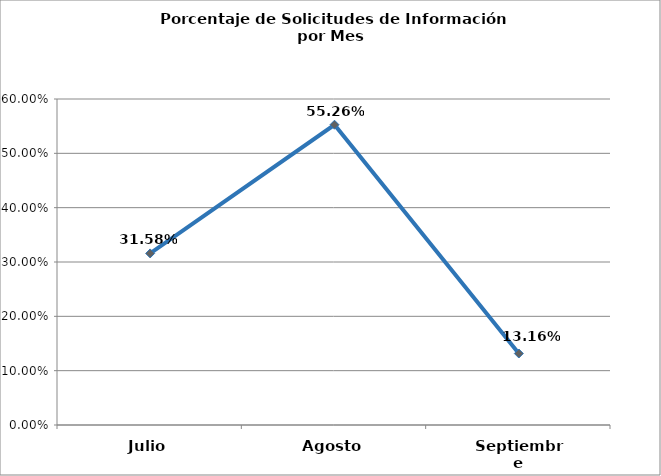
| Category | Series 0 |
|---|---|
| Julio | 0.316 |
| Agosto | 0.553 |
| Septiembre | 0.132 |